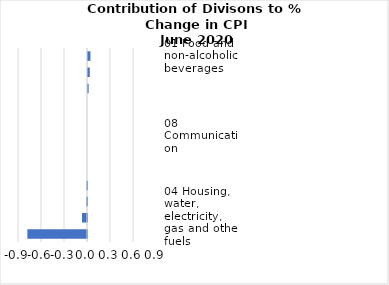
| Category |     Contributions |
|---|---|
| 01 Food and non-alcoholic beverages | 0.032 |
| 02 Alcoholic beverages, tobacco and narcotics | 0.023 |
| 12 Miscellaneous goods and services | 0.009 |
| 11 Restaurants and hotels | 0 |
| 10 Education | 0 |
| 08 Communication | 0 |
| 09 Recreation and culture | 0 |
| 03 Clothing and footwear | 0 |
| 05 Furnishings, household equipment and routine household maintenance | -0.008 |
| 06 Health | -0.011 |
| 04 Housing, water, electricity, gas and other fuels | -0.065 |
| 07 Transport | -0.778 |